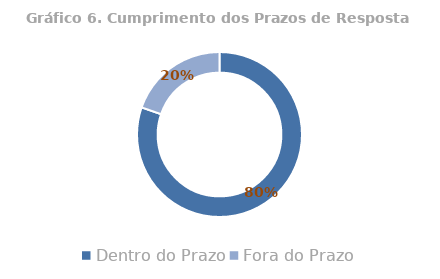
| Category | Total |
|---|---|
| Dentro do Prazo | 0.803 |
| Fora do Prazo | 0.197 |